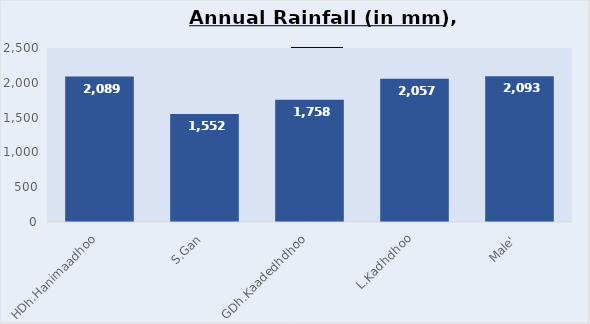
| Category | Series 0 |
|---|---|
| HDh.Hanimaadhoo | 2088.8 |
| S.Gan | 1551.5 |
| GDh.Kaadedhdhoo | 1757.5 |
| L.Kadhdhoo | 2056.8 |
| Male' | 2093.2 |